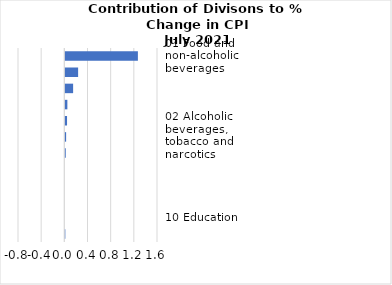
| Category |     Contributions |
|---|---|
| 01 Food and non-alcoholic beverages | 1.253 |
| 03 Clothing and footwear | 0.221 |
| 07 Transport | 0.134 |
| 12 Miscellaneous goods and services | 0.035 |
| 04 Housing, water, electricity, gas and other fuels | 0.029 |
| 02 Alcoholic beverages, tobacco and narcotics | 0.014 |
| 05 Furnishings, household equipment and routine household maintenance | 0.007 |
| 06 Health | 0 |
| 08 Communication | 0 |
| 11 Restaurants and hotels | 0 |
| 10 Education | 0 |
| 09 Recreation and culture | -0.003 |